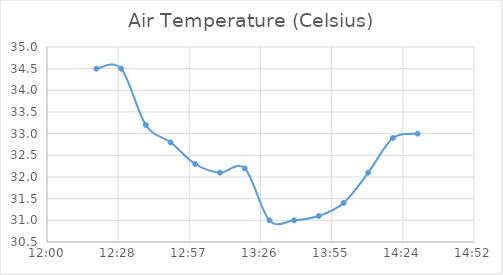
| Category | Air Temperature (Celsius) |
|---|---|
| 0.513888888888889 | 34.5 |
| 0.520833333333333 | 34.5 |
| 0.527777777777778 | 33.2 |
| 0.534722222222222 | 32.8 |
| 0.541666666666667 | 32.3 |
| 0.548611111111111 | 32.1 |
| 0.555555555555556 | 32.2 |
| 0.5625 | 31 |
| 0.569444444444444 | 31 |
| 0.576388888888889 | 31.1 |
| 0.583333333333333 | 31.4 |
| 0.590277777777778 | 32.1 |
| 0.597222222222222 | 32.9 |
| 0.604166666666667 | 33 |